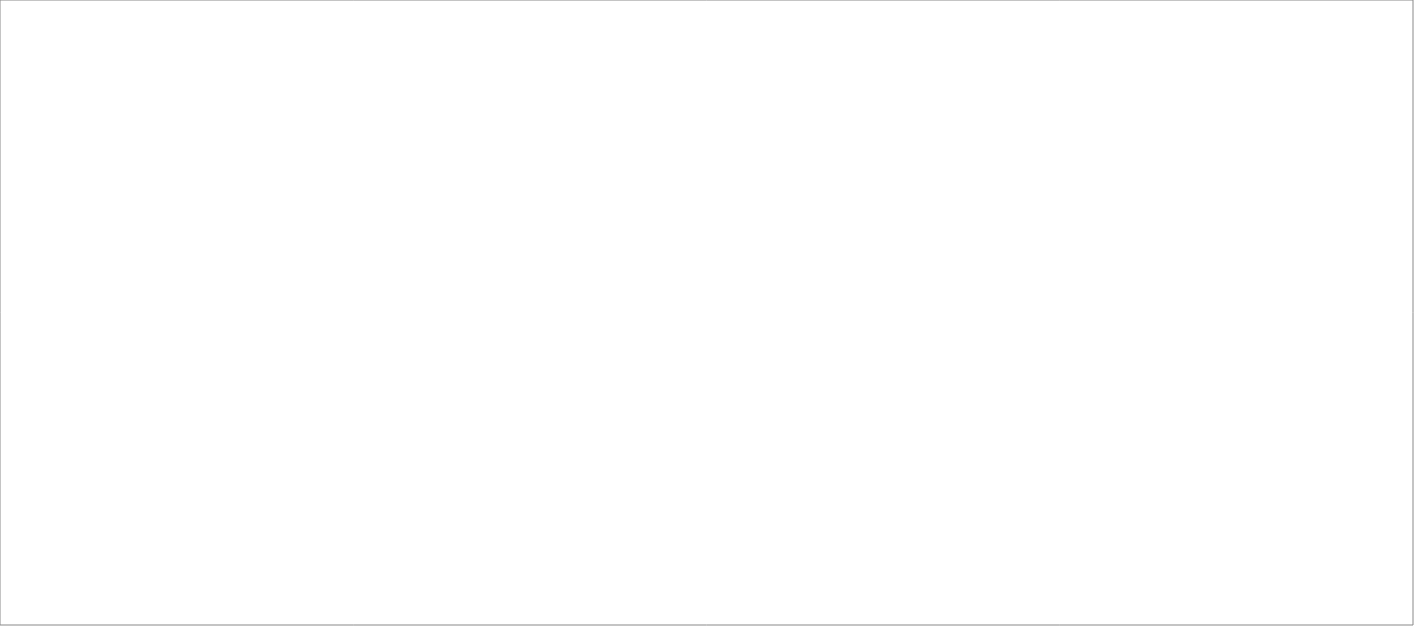
| Category | Total |
|---|---|
| Poolia Sverige AB | 85 |
| Randstad AB | 80 |
| Compass Rekrytering & Utveckling AB | 30.9 |
| Source Executive Recruitment Sweden AB | 25 |
| Lisberg Sverige AB | 25 |